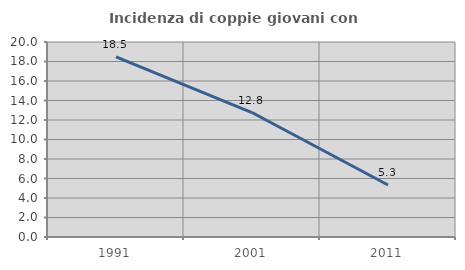
| Category | Incidenza di coppie giovani con figli |
|---|---|
| 1991.0 | 18.482 |
| 2001.0 | 12.766 |
| 2011.0 | 5.329 |